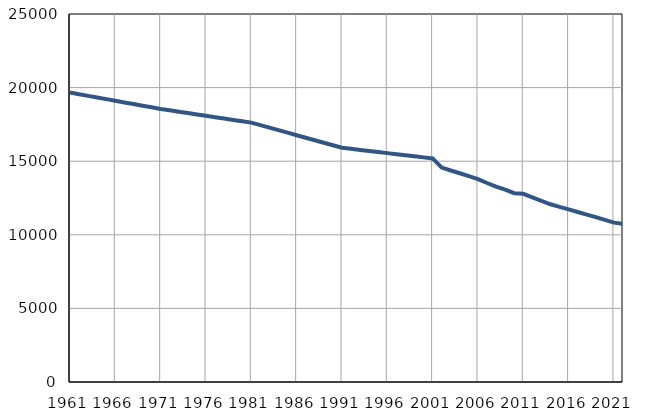
| Category | Број
становника |
|---|---|
| 1961.0 | 19662 |
| 1962.0 | 19551 |
| 1963.0 | 19439 |
| 1964.0 | 19328 |
| 1965.0 | 19216 |
| 1966.0 | 19105 |
| 1967.0 | 18994 |
| 1968.0 | 18883 |
| 1969.0 | 18772 |
| 1970.0 | 18660 |
| 1971.0 | 18549 |
| 1972.0 | 18456 |
| 1973.0 | 18364 |
| 1974.0 | 18270 |
| 1975.0 | 18177 |
| 1976.0 | 18085 |
| 1977.0 | 17992 |
| 1978.0 | 17899 |
| 1979.0 | 17805 |
| 1980.0 | 17713 |
| 1981.0 | 17620 |
| 1982.0 | 17449 |
| 1983.0 | 17279 |
| 1984.0 | 17108 |
| 1985.0 | 16937 |
| 1986.0 | 16765 |
| 1987.0 | 16595 |
| 1988.0 | 16424 |
| 1989.0 | 16254 |
| 1990.0 | 16083 |
| 1991.0 | 15912 |
| 1992.0 | 15839 |
| 1993.0 | 15767 |
| 1994.0 | 15694 |
| 1995.0 | 15622 |
| 1996.0 | 15549 |
| 1997.0 | 15476 |
| 1998.0 | 15404 |
| 1999.0 | 15332 |
| 2000.0 | 15259 |
| 2001.0 | 15186 |
| 2002.0 | 14568 |
| 2003.0 | 14367 |
| 2004.0 | 14181 |
| 2005.0 | 13985 |
| 2006.0 | 13783 |
| 2007.0 | 13518 |
| 2008.0 | 13271 |
| 2009.0 | 13067 |
| 2010.0 | 12827 |
| 2011.0 | 12787 |
| 2012.0 | 12549 |
| 2013.0 | 12298 |
| 2014.0 | 12073 |
| 2015.0 | 11893 |
| 2016.0 | 11723 |
| 2017.0 | 11549 |
| 2018.0 | 11374 |
| 2019.0 | 11204 |
| 2020.0 | 11017 |
| 2021.0 | 10825 |
| 2022.0 | 10741 |